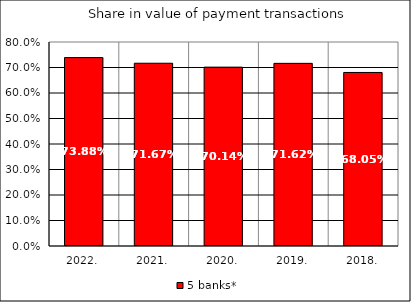
| Category | 5 banks* |
|---|---|
| 2022. | 0.739 |
| 2021. | 0.717 |
| 2020. | 0.701 |
| 2019. | 0.716 |
| 2018. | 0.681 |